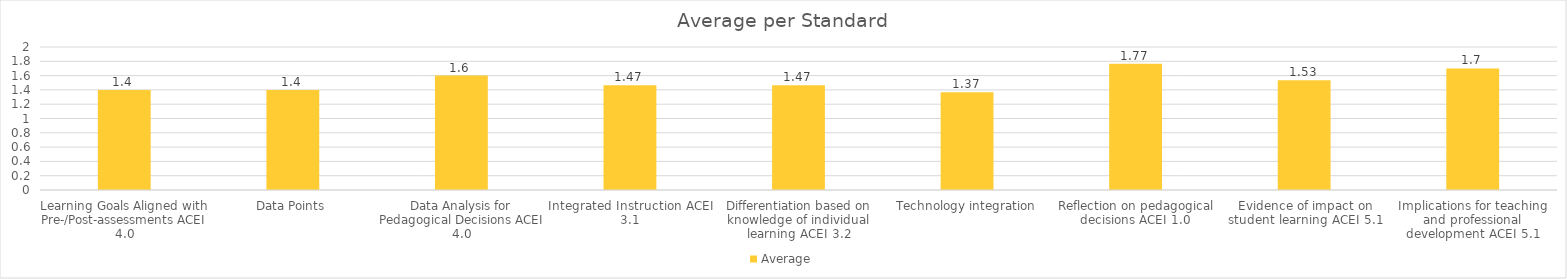
| Category | Average |
|---|---|
| Learning Goals Aligned with Pre-/Post-assessments ACEI 4.0 | 1.4 |
| Data Points | 1.4 |
| Data Analysis for Pedagogical Decisions ACEI 4.0 | 1.6 |
| Integrated Instruction ACEI 3.1 | 1.467 |
| Differentiation based on knowledge of individual learning ACEI 3.2 | 1.467 |
| Technology integration | 1.367 |
| Reflection on pedagogical decisions ACEI 1.0 | 1.767 |
| Evidence of impact on student learning ACEI 5.1 | 1.533 |
| Implications for teaching and professional development ACEI 5.1 | 1.7 |